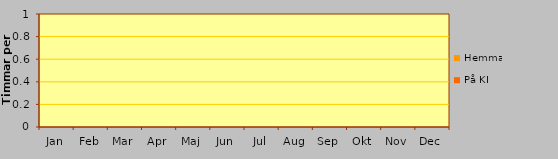
| Category | På KI | Hemma |
|---|---|---|
| Jan | 0 | 0 |
| Feb | 0 | 0 |
| Mar | 0 | 0 |
| Apr | 0 | 0 |
| Maj | 0 | 0 |
| Jun | 0 | 0 |
| Jul | 0 | 0 |
| Aug | 0 | 0 |
| Sep | 0 | 0 |
| Okt | 0 | 0 |
| Nov | 0 | 0 |
| Dec | 0 | 0 |